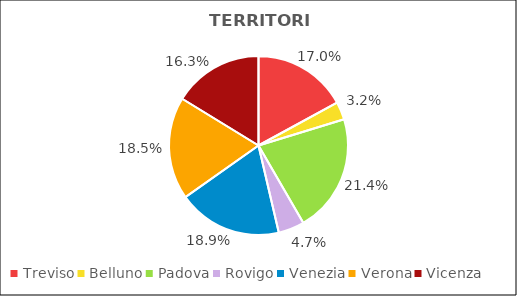
| Category | Series 0 |
|---|---|
| Treviso | 20156 |
| Belluno | 3835 |
| Padova | 25308 |
| Rovigo | 5572 |
| Venezia | 22317 |
| Verona | 21947 |
| Vicenza | 19242 |